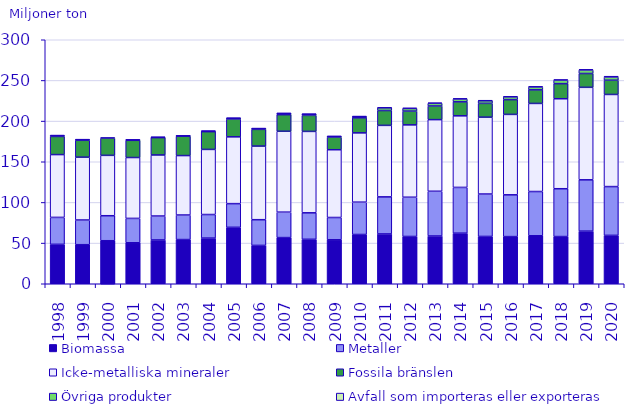
| Category | Biomassa | Metaller | Icke-metalliska mineraler | Fossila bränslen | Övriga produkter | Avfall som importeras eller exporteras |
|---|---|---|---|---|---|---|
| 1998.0 | 48.45 | 33.124 | 77.234 | 22.307 | 1.083 | 0 |
| 1999.0 | 48.012 | 30.373 | 77.263 | 20.74 | 0.784 | 0 |
| 2000.0 | 52.89 | 30.749 | 74.22 | 21.066 | 0.882 | 0 |
| 2001.0 | 50.374 | 29.982 | 74.843 | 21.147 | 0.553 | 0 |
| 2002.0 | 53.847 | 29.421 | 75.081 | 21.298 | 0.531 | 0.002 |
| 2003.0 | 54.338 | 30.173 | 73.097 | 23.796 | 0.472 | 0.002 |
| 2004.0 | 56.123 | 28.995 | 80.051 | 21.838 | 0.702 | 0.002 |
| 2005.0 | 69.39 | 29.115 | 82.129 | 21.876 | 1.108 | 0.017 |
| 2006.0 | 47.128 | 31.629 | 90.495 | 20.558 | 1.006 | 0.008 |
| 2007.0 | 56.754 | 31.276 | 99.466 | 20.378 | 1.629 | 0.013 |
| 2008.0 | 54.647 | 32.553 | 100.126 | 19.675 | 1.537 | 0.027 |
| 2009.0 | 54.056 | 27.403 | 83.328 | 15.4 | 1.024 | 0.156 |
| 2010.0 | 60.555 | 39.747 | 85.219 | 18.484 | 1.573 | 0.29 |
| 2011.0 | 61.242 | 45.578 | 87.908 | 18.247 | 3.384 | 0.46 |
| 2012.0 | 58.132 | 48.252 | 88.97 | 16.92 | 3.263 | 0.534 |
| 2013.0 | 58.707 | 55.01 | 88.057 | 16.775 | 3.334 | 0.56 |
| 2014.0 | 62.179 | 56.273 | 88.018 | 17.193 | 3.507 | 0.667 |
| 2015.0 | 58.158 | 52.17 | 94.499 | 16.98 | 3.187 | 0.671 |
| 2016.0 | 57.97 | 51.378 | 98.878 | 18.173 | 3.379 | 0.712 |
| 2017.0 | 58.993 | 54.402 | 108.309 | 16.718 | 3.511 | 0.756 |
| 2018.0 | 58.033 | 58.791 | 110.646 | 18.555 | 4.279 | 0.736 |
| 2019.0 | 64.699 | 63.088 | 113.727 | 16.971 | 4.357 | 0.773 |
| 2020.0 | 59.479 | 59.98 | 113.275 | 17.506 | 3.956 | 0.991 |